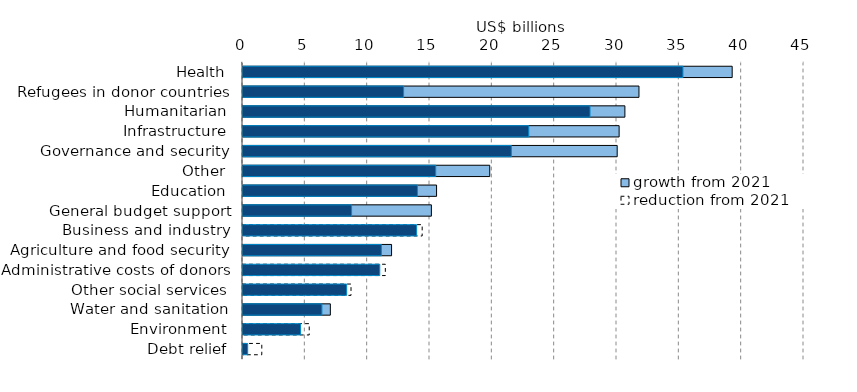
| Category | growth from 2021 | reduction from 2021 | Series 0 |
|---|---|---|---|
| Health | 39238.999 | 0 | 35288.511 |
| Refugees in donor countries | 31762.469 | 0 | 12882.622 |
| Humanitarian | 30633.986 | 0 | 27834.757 |
| Infrastructure | 30170.491 | 0 | 22922.712 |
| Governance and security | 30015.974 | 0 | 21525.377 |
| Other | 19792.273 | 0 | 15458.218 |
| Education | 15527.493 | 0 | 13991.491 |
| General budget support | 15110.485 | 0 | 8711.107 |
| Business and industry | 0 | 14372.204 | 13929.7 |
| Agriculture and food security | 11917.471 | 0 | 11100.681 |
| Administrative costs of donors | 0 | 11416.867 | 10971.882 |
| Other social services | 0 | 8663.542 | 8317.174 |
| Water and sanitation | 7007.427 | 0 | 6329.939 |
| Environment | 0 | 5312.701 | 4614.632 |
| Debt relief | 0 | 1506.996 | 375.21 |